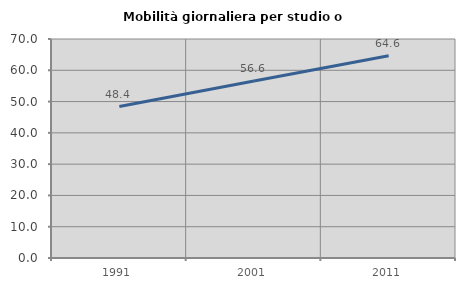
| Category | Mobilità giornaliera per studio o lavoro |
|---|---|
| 1991.0 | 48.411 |
| 2001.0 | 56.553 |
| 2011.0 | 64.647 |